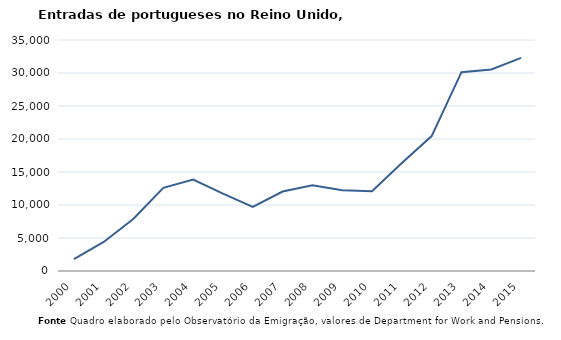
| Category | Entradas |
|---|---|
| 2000.0 | 1811 |
| 2001.0 | 4396 |
| 2002.0 | 7915 |
| 2003.0 | 12603 |
| 2004.0 | 13850 |
| 2005.0 | 11710 |
| 2006.0 | 9700 |
| 2007.0 | 12040 |
| 2008.0 | 12980 |
| 2009.0 | 12230 |
| 2010.0 | 12080 |
| 2011.0 | 16350 |
| 2012.0 | 20443 |
| 2013.0 | 30121 |
| 2014.0 | 30546 |
| 2015.0 | 32301 |